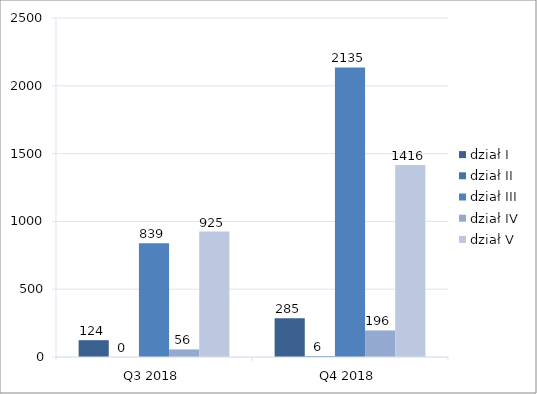
| Category | dział I | dział II | dział III | dział IV | dział V |
|---|---|---|---|---|---|
| Q3 2018 | 124 | 0 | 839 | 56 | 925 |
| Q4 2018 | 285 | 6 | 2135 | 196 | 1416 |